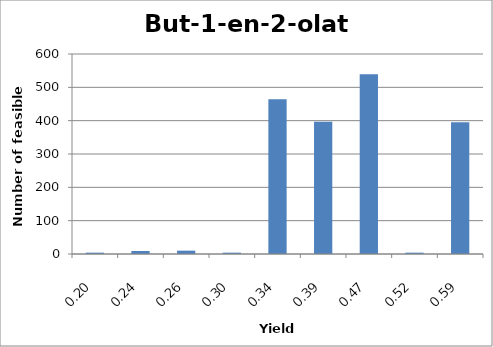
| Category | But-1-en-2-olate |
|---|---|
| 0.1967 | 4 |
| 0.236 | 9 |
| 0.2622 | 10 |
| 0.295 | 4 |
| 0.3371 | 464 |
| 0.3933 | 397 |
| 0.472 | 539 |
| 0.5244 | 4 |
| 0.59 | 395 |